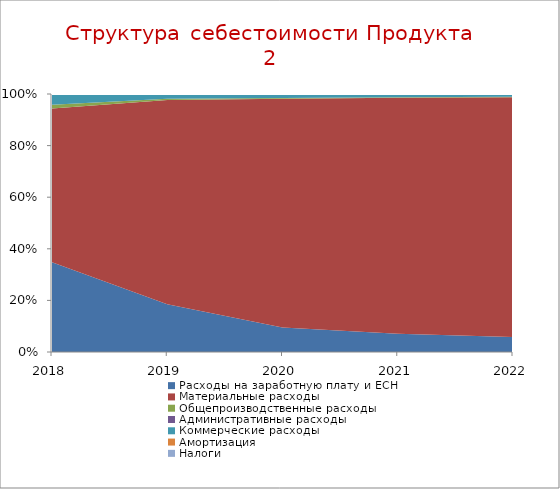
| Category | Расходы на заработную плату и ЕСН | Материальные расходы | Общепроизводственные расходы | Административные расходы | Коммерческие расходы | Амортизация | Налоги |
|---|---|---|---|---|---|---|---|
| 2018.0 | 0.348 | 0.596 | 0.014 | 0 | 0.042 | 0 | 0 |
| 2019.0 | 0.185 | 0.792 | 0.005 | 0 | 0.019 | 0 | 0 |
| 2020.0 | 0.095 | 0.887 | 0.003 | 0 | 0.016 | 0 | 0 |
| 2021.0 | 0.071 | 0.914 | 0.002 | 0 | 0.013 | 0 | 0 |
| 2022.0 | 0.058 | 0.929 | 0.002 | 0 | 0.01 | 0 | 0 |